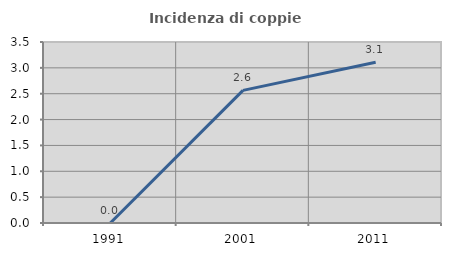
| Category | Incidenza di coppie miste |
|---|---|
| 1991.0 | 0 |
| 2001.0 | 2.564 |
| 2011.0 | 3.109 |